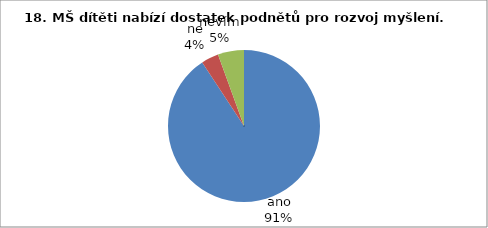
| Category | 18. |
|---|---|
| ano | 49 |
| ne | 2 |
| nevím | 3 |